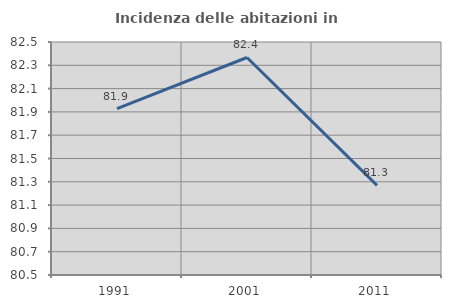
| Category | Incidenza delle abitazioni in proprietà  |
|---|---|
| 1991.0 | 81.928 |
| 2001.0 | 82.367 |
| 2011.0 | 81.27 |